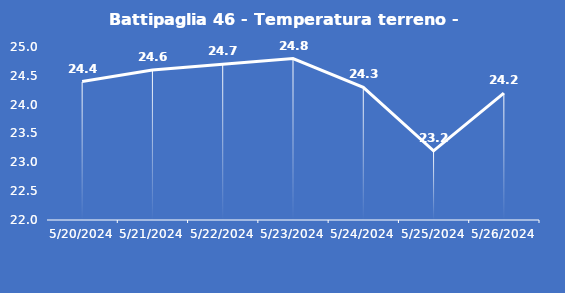
| Category | Battipaglia 46 - Temperatura terreno - Max (°C) |
|---|---|
| 5/20/24 | 24.4 |
| 5/21/24 | 24.6 |
| 5/22/24 | 24.7 |
| 5/23/24 | 24.8 |
| 5/24/24 | 24.3 |
| 5/25/24 | 23.2 |
| 5/26/24 | 24.2 |